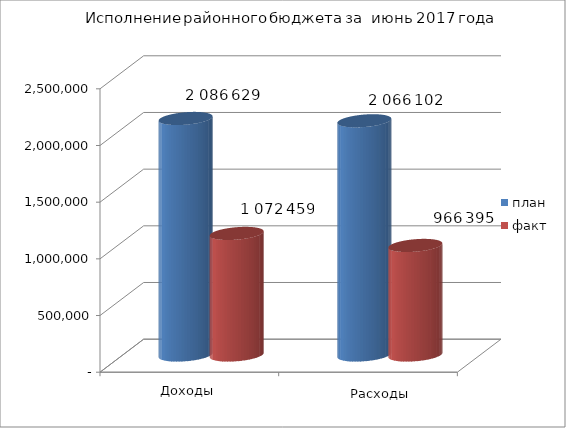
| Category | план | факт |
|---|---|---|
| 0 | 2086629 | 1072459 |
| 1 | 2066102 | 966394.9 |